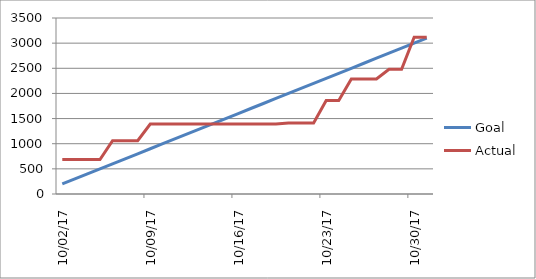
| Category | Goal | Actual |
|---|---|---|
| 2017-10-02 | 200 | 685 |
| 2017-10-03 | 300 | 685 |
| 2017-10-04 | 400 | 685 |
| 2017-10-05 | 500 | 685 |
| 2017-10-06 | 600 | 1061 |
| 2017-10-07 | 700 | 1061 |
| 2017-10-08 | 800 | 1061 |
| 2017-10-09 | 900 | 1392 |
| 2017-10-10 | 1000 | 1392 |
| 2017-10-11 | 1100 | 1392 |
| 2017-10-12 | 1200 | 1392 |
| 2017-10-13 | 1300 | 1392 |
| 2017-10-14 | 1400 | 1392 |
| 2017-10-15 | 1500 | 1392 |
| 2017-10-16 | 1600 | 1392 |
| 2017-10-17 | 1700 | 1392 |
| 2017-10-18 | 1800 | 1392 |
| 2017-10-19 | 1900 | 1392 |
| 2017-10-20 | 2000 | 1412 |
| 2017-10-21 | 2100 | 1412 |
| 2017-10-22 | 2200 | 1412 |
| 2017-10-23 | 2300 | 1857 |
| 2017-10-24 | 2400 | 1857 |
| 2017-10-25 | 2500 | 2286 |
| 2017-10-26 | 2600 | 2286 |
| 2017-10-27 | 2700 | 2286 |
| 2017-10-28 | 2800 | 2479 |
| 2017-10-29 | 2900 | 2479 |
| 2017-10-30 | 3000 | 3119 |
| 2017-10-31 | 3100 | 3119 |